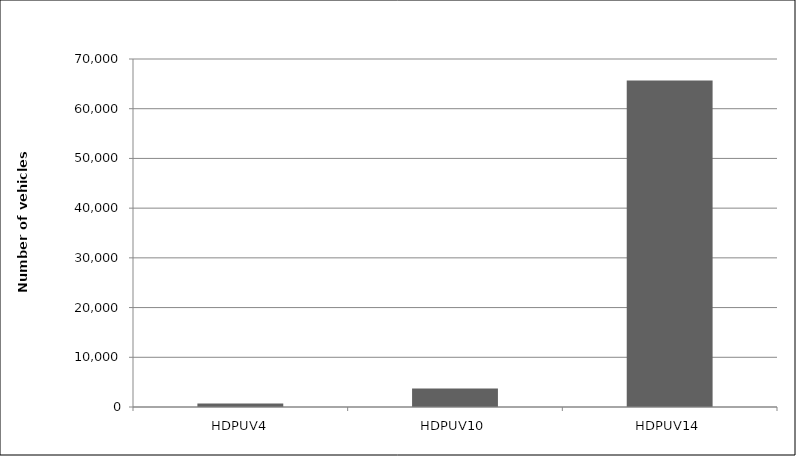
| Category | Number of Vehicles Removed from Fleet Corresponding to Emissions Reductions from Baseline Alternative |
|---|---|
| HDPUV4 | 726.687 |
| HDPUV10 | 3708.859 |
| HDPUV14 | 65670.61 |